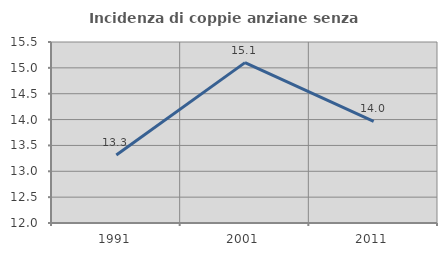
| Category | Incidenza di coppie anziane senza figli  |
|---|---|
| 1991.0 | 13.316 |
| 2001.0 | 15.102 |
| 2011.0 | 13.966 |